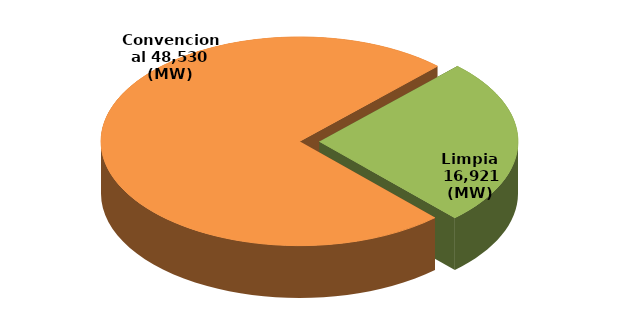
| Category | Series 0 |
|---|---|
| Convencional | 48530 |
| Limpia | 16921 |